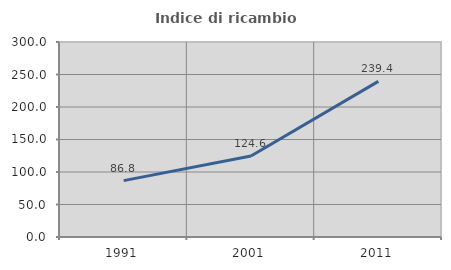
| Category | Indice di ricambio occupazionale  |
|---|---|
| 1991.0 | 86.751 |
| 2001.0 | 124.634 |
| 2011.0 | 239.41 |